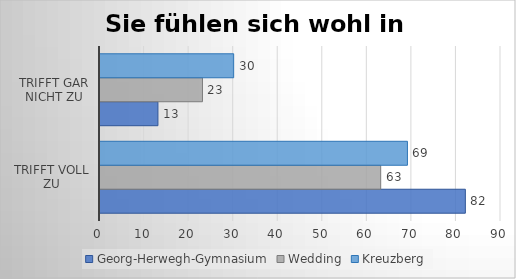
| Category | Georg-Herwegh-Gymnasium | Wedding | Kreuzberg |
|---|---|---|---|
| trifft voll zu | 82 | 63 | 69 |
| trifft gar nicht zu | 13 | 23 | 30 |